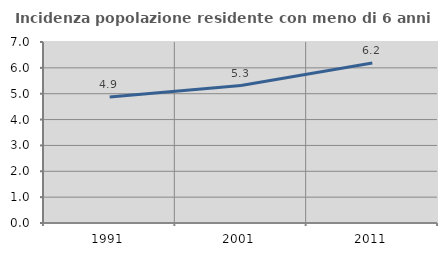
| Category | Incidenza popolazione residente con meno di 6 anni |
|---|---|
| 1991.0 | 4.873 |
| 2001.0 | 5.316 |
| 2011.0 | 6.185 |